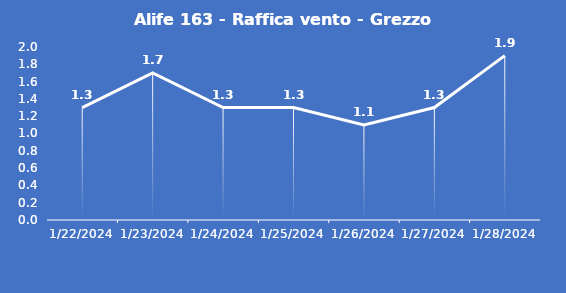
| Category | Alife 163 - Raffica vento - Grezzo (m/s) |
|---|---|
| 1/22/24 | 1.3 |
| 1/23/24 | 1.7 |
| 1/24/24 | 1.3 |
| 1/25/24 | 1.3 |
| 1/26/24 | 1.1 |
| 1/27/24 | 1.3 |
| 1/28/24 | 1.9 |